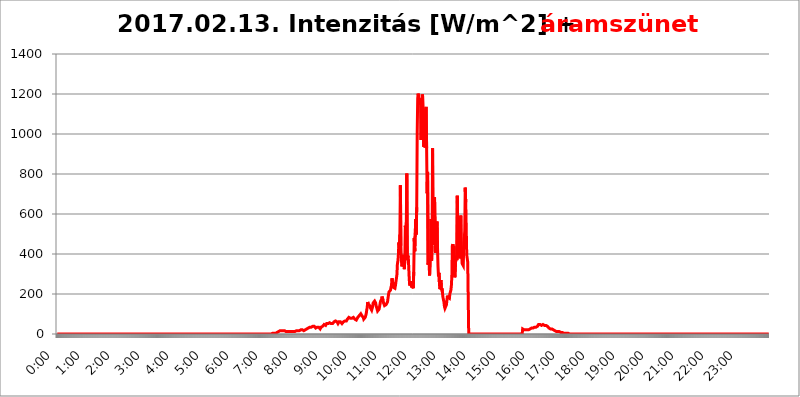
| Category | 2017.02.13. Intenzitás [W/m^2] + áramszünet |
|---|---|
| 0.0 | 0 |
| 0.0006944444444444445 | 0 |
| 0.001388888888888889 | 0 |
| 0.0020833333333333333 | 0 |
| 0.002777777777777778 | 0 |
| 0.003472222222222222 | 0 |
| 0.004166666666666667 | 0 |
| 0.004861111111111111 | 0 |
| 0.005555555555555556 | 0 |
| 0.0062499999999999995 | 0 |
| 0.006944444444444444 | 0 |
| 0.007638888888888889 | 0 |
| 0.008333333333333333 | 0 |
| 0.009027777777777779 | 0 |
| 0.009722222222222222 | 0 |
| 0.010416666666666666 | 0 |
| 0.011111111111111112 | 0 |
| 0.011805555555555555 | 0 |
| 0.012499999999999999 | 0 |
| 0.013194444444444444 | 0 |
| 0.013888888888888888 | 0 |
| 0.014583333333333332 | 0 |
| 0.015277777777777777 | 0 |
| 0.015972222222222224 | 0 |
| 0.016666666666666666 | 0 |
| 0.017361111111111112 | 0 |
| 0.018055555555555557 | 0 |
| 0.01875 | 0 |
| 0.019444444444444445 | 0 |
| 0.02013888888888889 | 0 |
| 0.020833333333333332 | 0 |
| 0.02152777777777778 | 0 |
| 0.022222222222222223 | 0 |
| 0.02291666666666667 | 0 |
| 0.02361111111111111 | 0 |
| 0.024305555555555556 | 0 |
| 0.024999999999999998 | 0 |
| 0.025694444444444447 | 0 |
| 0.02638888888888889 | 0 |
| 0.027083333333333334 | 0 |
| 0.027777777777777776 | 0 |
| 0.02847222222222222 | 0 |
| 0.029166666666666664 | 0 |
| 0.029861111111111113 | 0 |
| 0.030555555555555555 | 0 |
| 0.03125 | 0 |
| 0.03194444444444445 | 0 |
| 0.03263888888888889 | 0 |
| 0.03333333333333333 | 0 |
| 0.034027777777777775 | 0 |
| 0.034722222222222224 | 0 |
| 0.035416666666666666 | 0 |
| 0.036111111111111115 | 0 |
| 0.03680555555555556 | 0 |
| 0.0375 | 0 |
| 0.03819444444444444 | 0 |
| 0.03888888888888889 | 0 |
| 0.03958333333333333 | 0 |
| 0.04027777777777778 | 0 |
| 0.04097222222222222 | 0 |
| 0.041666666666666664 | 0 |
| 0.042361111111111106 | 0 |
| 0.04305555555555556 | 0 |
| 0.043750000000000004 | 0 |
| 0.044444444444444446 | 0 |
| 0.04513888888888889 | 0 |
| 0.04583333333333334 | 0 |
| 0.04652777777777778 | 0 |
| 0.04722222222222222 | 0 |
| 0.04791666666666666 | 0 |
| 0.04861111111111111 | 0 |
| 0.049305555555555554 | 0 |
| 0.049999999999999996 | 0 |
| 0.05069444444444445 | 0 |
| 0.051388888888888894 | 0 |
| 0.052083333333333336 | 0 |
| 0.05277777777777778 | 0 |
| 0.05347222222222222 | 0 |
| 0.05416666666666667 | 0 |
| 0.05486111111111111 | 0 |
| 0.05555555555555555 | 0 |
| 0.05625 | 0 |
| 0.05694444444444444 | 0 |
| 0.057638888888888885 | 0 |
| 0.05833333333333333 | 0 |
| 0.05902777777777778 | 0 |
| 0.059722222222222225 | 0 |
| 0.06041666666666667 | 0 |
| 0.061111111111111116 | 0 |
| 0.06180555555555556 | 0 |
| 0.0625 | 0 |
| 0.06319444444444444 | 0 |
| 0.06388888888888888 | 0 |
| 0.06458333333333334 | 0 |
| 0.06527777777777778 | 0 |
| 0.06597222222222222 | 0 |
| 0.06666666666666667 | 0 |
| 0.06736111111111111 | 0 |
| 0.06805555555555555 | 0 |
| 0.06874999999999999 | 0 |
| 0.06944444444444443 | 0 |
| 0.07013888888888889 | 0 |
| 0.07083333333333333 | 0 |
| 0.07152777777777779 | 0 |
| 0.07222222222222223 | 0 |
| 0.07291666666666667 | 0 |
| 0.07361111111111111 | 0 |
| 0.07430555555555556 | 0 |
| 0.075 | 0 |
| 0.07569444444444444 | 0 |
| 0.0763888888888889 | 0 |
| 0.07708333333333334 | 0 |
| 0.07777777777777778 | 0 |
| 0.07847222222222222 | 0 |
| 0.07916666666666666 | 0 |
| 0.0798611111111111 | 0 |
| 0.08055555555555556 | 0 |
| 0.08125 | 0 |
| 0.08194444444444444 | 0 |
| 0.08263888888888889 | 0 |
| 0.08333333333333333 | 0 |
| 0.08402777777777777 | 0 |
| 0.08472222222222221 | 0 |
| 0.08541666666666665 | 0 |
| 0.08611111111111112 | 0 |
| 0.08680555555555557 | 0 |
| 0.08750000000000001 | 0 |
| 0.08819444444444445 | 0 |
| 0.08888888888888889 | 0 |
| 0.08958333333333333 | 0 |
| 0.09027777777777778 | 0 |
| 0.09097222222222222 | 0 |
| 0.09166666666666667 | 0 |
| 0.09236111111111112 | 0 |
| 0.09305555555555556 | 0 |
| 0.09375 | 0 |
| 0.09444444444444444 | 0 |
| 0.09513888888888888 | 0 |
| 0.09583333333333333 | 0 |
| 0.09652777777777777 | 0 |
| 0.09722222222222222 | 0 |
| 0.09791666666666667 | 0 |
| 0.09861111111111111 | 0 |
| 0.09930555555555555 | 0 |
| 0.09999999999999999 | 0 |
| 0.10069444444444443 | 0 |
| 0.1013888888888889 | 0 |
| 0.10208333333333335 | 0 |
| 0.10277777777777779 | 0 |
| 0.10347222222222223 | 0 |
| 0.10416666666666667 | 0 |
| 0.10486111111111111 | 0 |
| 0.10555555555555556 | 0 |
| 0.10625 | 0 |
| 0.10694444444444444 | 0 |
| 0.1076388888888889 | 0 |
| 0.10833333333333334 | 0 |
| 0.10902777777777778 | 0 |
| 0.10972222222222222 | 0 |
| 0.1111111111111111 | 0 |
| 0.11180555555555556 | 0 |
| 0.11180555555555556 | 0 |
| 0.1125 | 0 |
| 0.11319444444444444 | 0 |
| 0.11388888888888889 | 0 |
| 0.11458333333333333 | 0 |
| 0.11527777777777777 | 0 |
| 0.11597222222222221 | 0 |
| 0.11666666666666665 | 0 |
| 0.1173611111111111 | 0 |
| 0.11805555555555557 | 0 |
| 0.11944444444444445 | 0 |
| 0.12013888888888889 | 0 |
| 0.12083333333333333 | 0 |
| 0.12152777777777778 | 0 |
| 0.12222222222222223 | 0 |
| 0.12291666666666667 | 0 |
| 0.12291666666666667 | 0 |
| 0.12361111111111112 | 0 |
| 0.12430555555555556 | 0 |
| 0.125 | 0 |
| 0.12569444444444444 | 0 |
| 0.12638888888888888 | 0 |
| 0.12708333333333333 | 0 |
| 0.16875 | 0 |
| 0.12847222222222224 | 0 |
| 0.12916666666666668 | 0 |
| 0.12986111111111112 | 0 |
| 0.13055555555555556 | 0 |
| 0.13125 | 0 |
| 0.13194444444444445 | 0 |
| 0.1326388888888889 | 0 |
| 0.13333333333333333 | 0 |
| 0.13402777777777777 | 0 |
| 0.13402777777777777 | 0 |
| 0.13472222222222222 | 0 |
| 0.13541666666666666 | 0 |
| 0.1361111111111111 | 0 |
| 0.13749999999999998 | 0 |
| 0.13819444444444443 | 0 |
| 0.1388888888888889 | 0 |
| 0.13958333333333334 | 0 |
| 0.14027777777777778 | 0 |
| 0.14097222222222222 | 0 |
| 0.14166666666666666 | 0 |
| 0.1423611111111111 | 0 |
| 0.14305555555555557 | 0 |
| 0.14375000000000002 | 0 |
| 0.14444444444444446 | 0 |
| 0.1451388888888889 | 0 |
| 0.1451388888888889 | 0 |
| 0.14652777777777778 | 0 |
| 0.14722222222222223 | 0 |
| 0.14791666666666667 | 0 |
| 0.1486111111111111 | 0 |
| 0.14930555555555555 | 0 |
| 0.15 | 0 |
| 0.15069444444444444 | 0 |
| 0.15138888888888888 | 0 |
| 0.15208333333333332 | 0 |
| 0.15277777777777776 | 0 |
| 0.15347222222222223 | 0 |
| 0.15416666666666667 | 0 |
| 0.15486111111111112 | 0 |
| 0.15555555555555556 | 0 |
| 0.15625 | 0 |
| 0.15694444444444444 | 0 |
| 0.15763888888888888 | 0 |
| 0.15833333333333333 | 0 |
| 0.15902777777777777 | 0 |
| 0.15972222222222224 | 0 |
| 0.16041666666666668 | 0 |
| 0.16111111111111112 | 0 |
| 0.16180555555555556 | 0 |
| 0.1625 | 0 |
| 0.16319444444444445 | 0 |
| 0.1638888888888889 | 0 |
| 0.16458333333333333 | 0 |
| 0.16527777777777777 | 0 |
| 0.16597222222222222 | 0 |
| 0.16666666666666666 | 0 |
| 0.1673611111111111 | 0 |
| 0.16805555555555554 | 0 |
| 0.16874999999999998 | 0 |
| 0.16944444444444443 | 0 |
| 0.17013888888888887 | 0 |
| 0.1708333333333333 | 0 |
| 0.17152777777777775 | 0 |
| 0.17222222222222225 | 0 |
| 0.1729166666666667 | 0 |
| 0.17361111111111113 | 0 |
| 0.17430555555555557 | 0 |
| 0.17500000000000002 | 0 |
| 0.17569444444444446 | 0 |
| 0.1763888888888889 | 0 |
| 0.17708333333333334 | 0 |
| 0.17777777777777778 | 0 |
| 0.17847222222222223 | 0 |
| 0.17916666666666667 | 0 |
| 0.1798611111111111 | 0 |
| 0.18055555555555555 | 0 |
| 0.18125 | 0 |
| 0.18194444444444444 | 0 |
| 0.1826388888888889 | 0 |
| 0.18333333333333335 | 0 |
| 0.1840277777777778 | 0 |
| 0.18472222222222223 | 0 |
| 0.18541666666666667 | 0 |
| 0.18611111111111112 | 0 |
| 0.18680555555555556 | 0 |
| 0.1875 | 0 |
| 0.18819444444444444 | 0 |
| 0.18888888888888888 | 0 |
| 0.18958333333333333 | 0 |
| 0.19027777777777777 | 0 |
| 0.1909722222222222 | 0 |
| 0.19166666666666665 | 0 |
| 0.19236111111111112 | 0 |
| 0.19305555555555554 | 0 |
| 0.19375 | 0 |
| 0.19444444444444445 | 0 |
| 0.1951388888888889 | 0 |
| 0.19583333333333333 | 0 |
| 0.19652777777777777 | 0 |
| 0.19722222222222222 | 0 |
| 0.19791666666666666 | 0 |
| 0.1986111111111111 | 0 |
| 0.19930555555555554 | 0 |
| 0.19999999999999998 | 0 |
| 0.20069444444444443 | 0 |
| 0.20138888888888887 | 0 |
| 0.2020833333333333 | 0 |
| 0.2027777777777778 | 0 |
| 0.2034722222222222 | 0 |
| 0.2041666666666667 | 0 |
| 0.20486111111111113 | 0 |
| 0.20555555555555557 | 0 |
| 0.20625000000000002 | 0 |
| 0.20694444444444446 | 0 |
| 0.2076388888888889 | 0 |
| 0.20833333333333334 | 0 |
| 0.20902777777777778 | 0 |
| 0.20972222222222223 | 0 |
| 0.21041666666666667 | 0 |
| 0.2111111111111111 | 0 |
| 0.21180555555555555 | 0 |
| 0.2125 | 0 |
| 0.21319444444444444 | 0 |
| 0.2138888888888889 | 0 |
| 0.21458333333333335 | 0 |
| 0.2152777777777778 | 0 |
| 0.21597222222222223 | 0 |
| 0.21666666666666667 | 0 |
| 0.21736111111111112 | 0 |
| 0.21805555555555556 | 0 |
| 0.21875 | 0 |
| 0.21944444444444444 | 0 |
| 0.22013888888888888 | 0 |
| 0.22083333333333333 | 0 |
| 0.22152777777777777 | 0 |
| 0.2222222222222222 | 0 |
| 0.22291666666666665 | 0 |
| 0.2236111111111111 | 0 |
| 0.22430555555555556 | 0 |
| 0.225 | 0 |
| 0.22569444444444445 | 0 |
| 0.2263888888888889 | 0 |
| 0.22708333333333333 | 0 |
| 0.22777777777777777 | 0 |
| 0.22847222222222222 | 0 |
| 0.22916666666666666 | 0 |
| 0.2298611111111111 | 0 |
| 0.23055555555555554 | 0 |
| 0.23124999999999998 | 0 |
| 0.23194444444444443 | 0 |
| 0.23263888888888887 | 0 |
| 0.2333333333333333 | 0 |
| 0.2340277777777778 | 0 |
| 0.2347222222222222 | 0 |
| 0.2354166666666667 | 0 |
| 0.23611111111111113 | 0 |
| 0.23680555555555557 | 0 |
| 0.23750000000000002 | 0 |
| 0.23819444444444446 | 0 |
| 0.2388888888888889 | 0 |
| 0.23958333333333334 | 0 |
| 0.24027777777777778 | 0 |
| 0.24097222222222223 | 0 |
| 0.24166666666666667 | 0 |
| 0.2423611111111111 | 0 |
| 0.24305555555555555 | 0 |
| 0.24375 | 0 |
| 0.24444444444444446 | 0 |
| 0.24513888888888888 | 0 |
| 0.24583333333333335 | 0 |
| 0.2465277777777778 | 0 |
| 0.24722222222222223 | 0 |
| 0.24791666666666667 | 0 |
| 0.24861111111111112 | 0 |
| 0.24930555555555556 | 0 |
| 0.25 | 0 |
| 0.25069444444444444 | 0 |
| 0.2513888888888889 | 0 |
| 0.2520833333333333 | 0 |
| 0.25277777777777777 | 0 |
| 0.2534722222222222 | 0 |
| 0.25416666666666665 | 0 |
| 0.2548611111111111 | 0 |
| 0.2555555555555556 | 0 |
| 0.25625000000000003 | 0 |
| 0.2569444444444445 | 0 |
| 0.2576388888888889 | 0 |
| 0.25833333333333336 | 0 |
| 0.2590277777777778 | 0 |
| 0.25972222222222224 | 0 |
| 0.2604166666666667 | 0 |
| 0.2611111111111111 | 0 |
| 0.26180555555555557 | 0 |
| 0.2625 | 0 |
| 0.26319444444444445 | 0 |
| 0.2638888888888889 | 0 |
| 0.26458333333333334 | 0 |
| 0.2652777777777778 | 0 |
| 0.2659722222222222 | 0 |
| 0.26666666666666666 | 0 |
| 0.2673611111111111 | 0 |
| 0.26805555555555555 | 0 |
| 0.26875 | 0 |
| 0.26944444444444443 | 0 |
| 0.2701388888888889 | 0 |
| 0.2708333333333333 | 0 |
| 0.27152777777777776 | 0 |
| 0.2722222222222222 | 0 |
| 0.27291666666666664 | 0 |
| 0.2736111111111111 | 0 |
| 0.2743055555555555 | 0 |
| 0.27499999999999997 | 0 |
| 0.27569444444444446 | 0 |
| 0.27638888888888885 | 0 |
| 0.27708333333333335 | 0 |
| 0.2777777777777778 | 0 |
| 0.27847222222222223 | 0 |
| 0.2791666666666667 | 0 |
| 0.2798611111111111 | 0 |
| 0.28055555555555556 | 0 |
| 0.28125 | 0 |
| 0.28194444444444444 | 0 |
| 0.2826388888888889 | 0 |
| 0.2833333333333333 | 0 |
| 0.28402777777777777 | 0 |
| 0.2847222222222222 | 0 |
| 0.28541666666666665 | 0 |
| 0.28611111111111115 | 0 |
| 0.28680555555555554 | 0 |
| 0.28750000000000003 | 0 |
| 0.2881944444444445 | 0 |
| 0.2888888888888889 | 0 |
| 0.28958333333333336 | 0 |
| 0.2902777777777778 | 0 |
| 0.29097222222222224 | 0 |
| 0.2916666666666667 | 0 |
| 0.2923611111111111 | 0 |
| 0.29305555555555557 | 0 |
| 0.29375 | 0 |
| 0.29444444444444445 | 0 |
| 0.2951388888888889 | 0 |
| 0.29583333333333334 | 0 |
| 0.2965277777777778 | 0 |
| 0.2972222222222222 | 0 |
| 0.29791666666666666 | 0 |
| 0.2986111111111111 | 0 |
| 0.29930555555555555 | 0 |
| 0.3 | 0 |
| 0.30069444444444443 | 3.525 |
| 0.3013888888888889 | 3.525 |
| 0.3020833333333333 | 3.525 |
| 0.30277777777777776 | 3.525 |
| 0.3034722222222222 | 3.525 |
| 0.30416666666666664 | 3.525 |
| 0.3048611111111111 | 3.525 |
| 0.3055555555555555 | 3.525 |
| 0.30624999999999997 | 3.525 |
| 0.3069444444444444 | 7.887 |
| 0.3076388888888889 | 7.887 |
| 0.30833333333333335 | 7.887 |
| 0.3090277777777778 | 12.257 |
| 0.30972222222222223 | 12.257 |
| 0.3104166666666667 | 12.257 |
| 0.3111111111111111 | 12.257 |
| 0.31180555555555556 | 12.257 |
| 0.3125 | 16.636 |
| 0.31319444444444444 | 16.636 |
| 0.3138888888888889 | 16.636 |
| 0.3145833333333333 | 16.636 |
| 0.31527777777777777 | 21.024 |
| 0.3159722222222222 | 21.024 |
| 0.31666666666666665 | 16.636 |
| 0.31736111111111115 | 16.636 |
| 0.31805555555555554 | 16.636 |
| 0.31875000000000003 | 16.636 |
| 0.3194444444444445 | 12.257 |
| 0.3201388888888889 | 12.257 |
| 0.32083333333333336 | 12.257 |
| 0.3215277777777778 | 12.257 |
| 0.32222222222222224 | 12.257 |
| 0.3229166666666667 | 12.257 |
| 0.3236111111111111 | 12.257 |
| 0.32430555555555557 | 12.257 |
| 0.325 | 12.257 |
| 0.32569444444444445 | 12.257 |
| 0.3263888888888889 | 16.636 |
| 0.32708333333333334 | 12.257 |
| 0.3277777777777778 | 12.257 |
| 0.3284722222222222 | 12.257 |
| 0.32916666666666666 | 12.257 |
| 0.3298611111111111 | 16.636 |
| 0.33055555555555555 | 16.636 |
| 0.33125 | 12.257 |
| 0.33194444444444443 | 12.257 |
| 0.3326388888888889 | 12.257 |
| 0.3333333333333333 | 12.257 |
| 0.3340277777777778 | 16.636 |
| 0.3347222222222222 | 16.636 |
| 0.3354166666666667 | 16.636 |
| 0.3361111111111111 | 16.636 |
| 0.3368055555555556 | 12.257 |
| 0.33749999999999997 | 16.636 |
| 0.33819444444444446 | 16.636 |
| 0.33888888888888885 | 16.636 |
| 0.33958333333333335 | 16.636 |
| 0.34027777777777773 | 21.024 |
| 0.34097222222222223 | 21.024 |
| 0.3416666666666666 | 21.024 |
| 0.3423611111111111 | 21.024 |
| 0.3430555555555555 | 21.024 |
| 0.34375 | 21.024 |
| 0.3444444444444445 | 16.636 |
| 0.3451388888888889 | 16.636 |
| 0.3458333333333334 | 16.636 |
| 0.34652777777777777 | 21.024 |
| 0.34722222222222227 | 21.024 |
| 0.34791666666666665 | 21.024 |
| 0.34861111111111115 | 21.024 |
| 0.34930555555555554 | 25.419 |
| 0.35000000000000003 | 25.419 |
| 0.3506944444444444 | 25.419 |
| 0.3513888888888889 | 25.419 |
| 0.3520833333333333 | 29.823 |
| 0.3527777777777778 | 29.823 |
| 0.3534722222222222 | 34.234 |
| 0.3541666666666667 | 34.234 |
| 0.3548611111111111 | 29.823 |
| 0.35555555555555557 | 29.823 |
| 0.35625 | 34.234 |
| 0.35694444444444445 | 38.653 |
| 0.3576388888888889 | 38.653 |
| 0.35833333333333334 | 38.653 |
| 0.3590277777777778 | 38.653 |
| 0.3597222222222222 | 38.653 |
| 0.36041666666666666 | 38.653 |
| 0.3611111111111111 | 34.234 |
| 0.36180555555555555 | 34.234 |
| 0.3625 | 29.823 |
| 0.36319444444444443 | 29.823 |
| 0.3638888888888889 | 34.234 |
| 0.3645833333333333 | 34.234 |
| 0.3652777777777778 | 34.234 |
| 0.3659722222222222 | 34.234 |
| 0.3666666666666667 | 34.234 |
| 0.3673611111111111 | 29.823 |
| 0.3680555555555556 | 29.823 |
| 0.36874999999999997 | 25.419 |
| 0.36944444444444446 | 25.419 |
| 0.37013888888888885 | 34.234 |
| 0.37083333333333335 | 38.653 |
| 0.37152777777777773 | 38.653 |
| 0.37222222222222223 | 38.653 |
| 0.3729166666666666 | 38.653 |
| 0.3736111111111111 | 43.079 |
| 0.3743055555555555 | 47.511 |
| 0.375 | 47.511 |
| 0.3756944444444445 | 43.079 |
| 0.3763888888888889 | 43.079 |
| 0.3770833333333334 | 47.511 |
| 0.37777777777777777 | 51.951 |
| 0.37847222222222227 | 56.398 |
| 0.37916666666666665 | 56.398 |
| 0.37986111111111115 | 51.951 |
| 0.38055555555555554 | 56.398 |
| 0.38125000000000003 | 56.398 |
| 0.3819444444444444 | 56.398 |
| 0.3826388888888889 | 51.951 |
| 0.3833333333333333 | 56.398 |
| 0.3840277777777778 | 51.951 |
| 0.3847222222222222 | 51.951 |
| 0.3854166666666667 | 51.951 |
| 0.3861111111111111 | 51.951 |
| 0.38680555555555557 | 47.511 |
| 0.3875 | 56.398 |
| 0.38819444444444445 | 60.85 |
| 0.3888888888888889 | 60.85 |
| 0.38958333333333334 | 60.85 |
| 0.3902777777777778 | 65.31 |
| 0.3909722222222222 | 65.31 |
| 0.39166666666666666 | 60.85 |
| 0.3923611111111111 | 60.85 |
| 0.39305555555555555 | 56.398 |
| 0.39375 | 51.951 |
| 0.39444444444444443 | 56.398 |
| 0.3951388888888889 | 60.85 |
| 0.3958333333333333 | 60.85 |
| 0.3965277777777778 | 60.85 |
| 0.3972222222222222 | 60.85 |
| 0.3979166666666667 | 56.398 |
| 0.3986111111111111 | 56.398 |
| 0.3993055555555556 | 51.951 |
| 0.39999999999999997 | 56.398 |
| 0.40069444444444446 | 56.398 |
| 0.40138888888888885 | 60.85 |
| 0.40208333333333335 | 60.85 |
| 0.40277777777777773 | 60.85 |
| 0.40347222222222223 | 65.31 |
| 0.4041666666666666 | 65.31 |
| 0.4048611111111111 | 65.31 |
| 0.4055555555555555 | 65.31 |
| 0.40625 | 69.775 |
| 0.4069444444444445 | 74.246 |
| 0.4076388888888889 | 78.722 |
| 0.4083333333333334 | 78.722 |
| 0.40902777777777777 | 83.205 |
| 0.40972222222222227 | 83.205 |
| 0.41041666666666665 | 83.205 |
| 0.41111111111111115 | 78.722 |
| 0.41180555555555554 | 78.722 |
| 0.41250000000000003 | 83.205 |
| 0.4131944444444444 | 78.722 |
| 0.4138888888888889 | 83.205 |
| 0.4145833333333333 | 83.205 |
| 0.4152777777777778 | 83.205 |
| 0.4159722222222222 | 78.722 |
| 0.4166666666666667 | 78.722 |
| 0.4173611111111111 | 74.246 |
| 0.41805555555555557 | 74.246 |
| 0.41875 | 69.775 |
| 0.41944444444444445 | 69.775 |
| 0.4201388888888889 | 74.246 |
| 0.42083333333333334 | 74.246 |
| 0.4215277777777778 | 83.205 |
| 0.4222222222222222 | 83.205 |
| 0.42291666666666666 | 87.692 |
| 0.4236111111111111 | 92.184 |
| 0.42430555555555555 | 92.184 |
| 0.425 | 96.682 |
| 0.42569444444444443 | 101.184 |
| 0.4263888888888889 | 101.184 |
| 0.4270833333333333 | 92.184 |
| 0.4277777777777778 | 96.682 |
| 0.4284722222222222 | 96.682 |
| 0.4291666666666667 | 83.205 |
| 0.4298611111111111 | 74.246 |
| 0.4305555555555556 | 74.246 |
| 0.43124999999999997 | 74.246 |
| 0.43194444444444446 | 83.205 |
| 0.43263888888888885 | 87.692 |
| 0.43333333333333335 | 101.184 |
| 0.43402777777777773 | 119.235 |
| 0.43472222222222223 | 132.814 |
| 0.4354166666666666 | 160.056 |
| 0.4361111111111111 | 150.964 |
| 0.4368055555555555 | 150.964 |
| 0.4375 | 150.964 |
| 0.4381944444444445 | 141.884 |
| 0.4388888888888889 | 132.814 |
| 0.4395833333333334 | 132.814 |
| 0.44027777777777777 | 137.347 |
| 0.44097222222222227 | 119.235 |
| 0.44166666666666665 | 114.716 |
| 0.44236111111111115 | 137.347 |
| 0.44305555555555554 | 155.509 |
| 0.44375000000000003 | 150.964 |
| 0.4444444444444444 | 150.964 |
| 0.4451388888888889 | 164.605 |
| 0.4458333333333333 | 169.156 |
| 0.4465277777777778 | 155.509 |
| 0.4472222222222222 | 141.884 |
| 0.4479166666666667 | 132.814 |
| 0.4486111111111111 | 128.284 |
| 0.44930555555555557 | 114.716 |
| 0.45 | 114.716 |
| 0.45069444444444445 | 114.716 |
| 0.4513888888888889 | 123.758 |
| 0.45208333333333334 | 137.347 |
| 0.4527777777777778 | 150.964 |
| 0.4534722222222222 | 164.605 |
| 0.45416666666666666 | 164.605 |
| 0.4548611111111111 | 173.709 |
| 0.45555555555555555 | 187.378 |
| 0.45625 | 187.378 |
| 0.45694444444444443 | 169.156 |
| 0.4576388888888889 | 155.509 |
| 0.4583333333333333 | 150.964 |
| 0.4590277777777778 | 141.884 |
| 0.4597222222222222 | 137.347 |
| 0.4604166666666667 | 137.347 |
| 0.4611111111111111 | 146.423 |
| 0.4618055555555556 | 146.423 |
| 0.46249999999999997 | 146.423 |
| 0.46319444444444446 | 160.056 |
| 0.46388888888888885 | 178.264 |
| 0.46458333333333335 | 196.497 |
| 0.46527777777777773 | 210.182 |
| 0.46597222222222223 | 205.62 |
| 0.4666666666666666 | 210.182 |
| 0.4673611111111111 | 219.309 |
| 0.4680555555555555 | 233 |
| 0.46875 | 242.127 |
| 0.4694444444444445 | 278.603 |
| 0.4701388888888889 | 278.603 |
| 0.4708333333333334 | 251.251 |
| 0.47152777777777777 | 233 |
| 0.47222222222222227 | 237.564 |
| 0.47291666666666665 | 228.436 |
| 0.47361111111111115 | 228.436 |
| 0.47430555555555554 | 242.127 |
| 0.47500000000000003 | 260.373 |
| 0.4756944444444444 | 264.932 |
| 0.4763888888888889 | 296.808 |
| 0.4770833333333333 | 351.198 |
| 0.4777777777777778 | 364.728 |
| 0.4784722222222222 | 396.164 |
| 0.4791666666666667 | 458.38 |
| 0.4798611111111111 | 427.39 |
| 0.48055555555555557 | 497.836 |
| 0.48125 | 743.859 |
| 0.48194444444444445 | 440.702 |
| 0.4826388888888889 | 369.23 |
| 0.48333333333333334 | 337.639 |
| 0.4840277777777778 | 333.113 |
| 0.4847222222222222 | 355.712 |
| 0.48541666666666666 | 396.164 |
| 0.4861111111111111 | 360.221 |
| 0.48680555555555555 | 324.052 |
| 0.4875 | 373.729 |
| 0.48819444444444443 | 541.121 |
| 0.4888888888888889 | 489.108 |
| 0.4895833333333333 | 558.261 |
| 0.4902777777777778 | 802.868 |
| 0.4909722222222222 | 369.23 |
| 0.4916666666666667 | 391.685 |
| 0.4923611111111111 | 382.715 |
| 0.4930555555555556 | 378.224 |
| 0.49374999999999997 | 269.49 |
| 0.49444444444444446 | 242.127 |
| 0.49513888888888885 | 246.689 |
| 0.49583333333333335 | 264.932 |
| 0.49652777777777773 | 242.127 |
| 0.49722222222222223 | 233 |
| 0.4979166666666666 | 251.251 |
| 0.4986111111111111 | 251.251 |
| 0.4993055555555555 | 228.436 |
| 0.5 | 310.44 |
| 0.5006944444444444 | 480.356 |
| 0.5013888888888889 | 414.035 |
| 0.5020833333333333 | 506.542 |
| 0.5027777777777778 | 575.299 |
| 0.5034722222222222 | 497.836 |
| 0.5041666666666667 | 634.105 |
| 0.5048611111111111 | 1007.383 |
| 0.5055555555555555 | 1178.177 |
| 0.50625 | 1201.843 |
| 0.5069444444444444 | 1178.177 |
| 0.5076388888888889 | 1178.177 |
| 0.5083333333333333 | 1147.086 |
| 0.5090277777777777 | 1166.46 |
| 0.5097222222222222 | 1178.177 |
| 0.5104166666666666 | 970.034 |
| 0.5111111111111112 | 1139.384 |
| 0.5118055555555555 | 1197.876 |
| 0.5125000000000001 | 1189.969 |
| 0.5131944444444444 | 1127.879 |
| 0.513888888888889 | 936.33 |
| 0.5145833333333333 | 1044.762 |
| 0.5152777777777778 | 1056.004 |
| 0.5159722222222222 | 932.576 |
| 0.5166666666666667 | 1124.056 |
| 0.517361111111111 | 1135.543 |
| 0.5180555555555556 | 928.819 |
| 0.5187499999999999 | 703.762 |
| 0.5194444444444445 | 810.641 |
| 0.5201388888888888 | 346.682 |
| 0.5208333333333334 | 360.221 |
| 0.5215277777777778 | 351.198 |
| 0.5222222222222223 | 292.259 |
| 0.5229166666666667 | 364.728 |
| 0.5236111111111111 | 378.224 |
| 0.5243055555555556 | 575.299 |
| 0.525 | 364.728 |
| 0.5256944444444445 | 440.702 |
| 0.5263888888888889 | 928.819 |
| 0.5270833333333333 | 493.475 |
| 0.5277777777777778 | 445.129 |
| 0.5284722222222222 | 458.38 |
| 0.5291666666666667 | 683.473 |
| 0.5298611111111111 | 541.121 |
| 0.5305555555555556 | 405.108 |
| 0.53125 | 405.108 |
| 0.5319444444444444 | 489.108 |
| 0.5326388888888889 | 562.53 |
| 0.5333333333333333 | 431.833 |
| 0.5340277777777778 | 337.639 |
| 0.5347222222222222 | 287.709 |
| 0.5354166666666667 | 305.898 |
| 0.5361111111111111 | 246.689 |
| 0.5368055555555555 | 223.873 |
| 0.5375 | 246.689 |
| 0.5381944444444444 | 269.49 |
| 0.5388888888888889 | 219.309 |
| 0.5395833333333333 | 228.436 |
| 0.5402777777777777 | 205.62 |
| 0.5409722222222222 | 182.82 |
| 0.5416666666666666 | 182.82 |
| 0.5423611111111112 | 160.056 |
| 0.5430555555555555 | 137.347 |
| 0.5437500000000001 | 128.284 |
| 0.5444444444444444 | 128.284 |
| 0.545138888888889 | 132.814 |
| 0.5458333333333333 | 146.423 |
| 0.5465277777777778 | 169.156 |
| 0.5472222222222222 | 191.937 |
| 0.5479166666666667 | 182.82 |
| 0.548611111111111 | 187.378 |
| 0.5493055555555556 | 187.378 |
| 0.5499999999999999 | 178.264 |
| 0.5506944444444445 | 201.058 |
| 0.5513888888888888 | 210.182 |
| 0.5520833333333334 | 219.309 |
| 0.5527777777777778 | 242.127 |
| 0.5534722222222223 | 292.259 |
| 0.5541666666666667 | 440.702 |
| 0.5548611111111111 | 449.551 |
| 0.5555555555555556 | 409.574 |
| 0.55625 | 440.702 |
| 0.5569444444444445 | 305.898 |
| 0.5576388888888889 | 283.156 |
| 0.5583333333333333 | 278.603 |
| 0.5590277777777778 | 382.715 |
| 0.5597222222222222 | 391.685 |
| 0.5604166666666667 | 369.23 |
| 0.5611111111111111 | 691.608 |
| 0.5618055555555556 | 471.582 |
| 0.5625 | 579.542 |
| 0.5631944444444444 | 405.108 |
| 0.5638888888888889 | 405.108 |
| 0.5645833333333333 | 378.224 |
| 0.5652777777777778 | 409.574 |
| 0.5659722222222222 | 592.233 |
| 0.5666666666666667 | 422.943 |
| 0.5673611111111111 | 431.833 |
| 0.5680555555555555 | 351.198 |
| 0.56875 | 351.198 |
| 0.5694444444444444 | 342.162 |
| 0.5701388888888889 | 440.702 |
| 0.5708333333333333 | 436.27 |
| 0.5715277777777777 | 515.223 |
| 0.5722222222222222 | 731.896 |
| 0.5729166666666666 | 658.909 |
| 0.5736111111111112 | 528.2 |
| 0.5743055555555555 | 396.164 |
| 0.5750000000000001 | 400.638 |
| 0.5756944444444444 | 360.221 |
| 0.576388888888889 | 360.221 |
| 0.5770833333333333 | 0 |
| 0.5777777777777778 | 0 |
| 0.5784722222222222 | 0 |
| 0.5791666666666667 | 0 |
| 0.579861111111111 | 0 |
| 0.5805555555555556 | 0 |
| 0.5812499999999999 | 0 |
| 0.5819444444444445 | 0 |
| 0.5826388888888888 | 0 |
| 0.5833333333333334 | 0 |
| 0.5840277777777778 | 0 |
| 0.5847222222222223 | 0 |
| 0.5854166666666667 | 0 |
| 0.5861111111111111 | 0 |
| 0.5868055555555556 | 0 |
| 0.5875 | 0 |
| 0.5881944444444445 | 0 |
| 0.5888888888888889 | 0 |
| 0.5895833333333333 | 0 |
| 0.5902777777777778 | 0 |
| 0.5909722222222222 | 0 |
| 0.5916666666666667 | 0 |
| 0.5923611111111111 | 0 |
| 0.5930555555555556 | 0 |
| 0.59375 | 0 |
| 0.5944444444444444 | 0 |
| 0.5951388888888889 | 0 |
| 0.5958333333333333 | 0 |
| 0.5965277777777778 | 0 |
| 0.5972222222222222 | 0 |
| 0.5979166666666667 | 0 |
| 0.5986111111111111 | 0 |
| 0.5993055555555555 | 0 |
| 0.6 | 0 |
| 0.6006944444444444 | 0 |
| 0.6013888888888889 | 0 |
| 0.6020833333333333 | 0 |
| 0.6027777777777777 | 0 |
| 0.6034722222222222 | 0 |
| 0.6041666666666666 | 0 |
| 0.6048611111111112 | 0 |
| 0.6055555555555555 | 0 |
| 0.6062500000000001 | 0 |
| 0.6069444444444444 | 0 |
| 0.607638888888889 | 0 |
| 0.6083333333333333 | 0 |
| 0.6090277777777778 | 0 |
| 0.6097222222222222 | 0 |
| 0.6104166666666667 | 0 |
| 0.611111111111111 | 0 |
| 0.6118055555555556 | 0 |
| 0.6124999999999999 | 0 |
| 0.6131944444444445 | 0 |
| 0.6138888888888888 | 0 |
| 0.6145833333333334 | 0 |
| 0.6152777777777778 | 0 |
| 0.6159722222222223 | 0 |
| 0.6166666666666667 | 0 |
| 0.6173611111111111 | 0 |
| 0.6180555555555556 | 0 |
| 0.61875 | 0 |
| 0.6194444444444445 | 0 |
| 0.6201388888888889 | 0 |
| 0.6208333333333333 | 0 |
| 0.6215277777777778 | 0 |
| 0.6222222222222222 | 0 |
| 0.6229166666666667 | 0 |
| 0.6236111111111111 | 0 |
| 0.6243055555555556 | 0 |
| 0.625 | 0 |
| 0.6256944444444444 | 0 |
| 0.6263888888888889 | 0 |
| 0.6270833333333333 | 0 |
| 0.6277777777777778 | 0 |
| 0.6284722222222222 | 0 |
| 0.6291666666666667 | 0 |
| 0.6298611111111111 | 0 |
| 0.6305555555555555 | 0 |
| 0.63125 | 0 |
| 0.6319444444444444 | 0 |
| 0.6326388888888889 | 0 |
| 0.6333333333333333 | 0 |
| 0.6340277777777777 | 0 |
| 0.6347222222222222 | 0 |
| 0.6354166666666666 | 0 |
| 0.6361111111111112 | 0 |
| 0.6368055555555555 | 0 |
| 0.6375000000000001 | 0 |
| 0.6381944444444444 | 0 |
| 0.638888888888889 | 0 |
| 0.6395833333333333 | 0 |
| 0.6402777777777778 | 0 |
| 0.6409722222222222 | 0 |
| 0.6416666666666667 | 0 |
| 0.642361111111111 | 0 |
| 0.6430555555555556 | 0 |
| 0.6437499999999999 | 0 |
| 0.6444444444444445 | 0 |
| 0.6451388888888888 | 0 |
| 0.6458333333333334 | 0 |
| 0.6465277777777778 | 0 |
| 0.6472222222222223 | 0 |
| 0.6479166666666667 | 0 |
| 0.6486111111111111 | 0 |
| 0.6493055555555556 | 0 |
| 0.65 | 0 |
| 0.6506944444444445 | 0 |
| 0.6513888888888889 | 0 |
| 0.6520833333333333 | 0 |
| 0.6527777777777778 | 25.419 |
| 0.6534722222222222 | 25.419 |
| 0.6541666666666667 | 21.024 |
| 0.6548611111111111 | 21.024 |
| 0.6555555555555556 | 21.024 |
| 0.65625 | 21.024 |
| 0.6569444444444444 | 21.024 |
| 0.6576388888888889 | 21.024 |
| 0.6583333333333333 | 21.024 |
| 0.6590277777777778 | 21.024 |
| 0.6597222222222222 | 21.024 |
| 0.6604166666666667 | 21.024 |
| 0.6611111111111111 | 21.024 |
| 0.6618055555555555 | 25.419 |
| 0.6625 | 25.419 |
| 0.6631944444444444 | 25.419 |
| 0.6638888888888889 | 25.419 |
| 0.6645833333333333 | 29.823 |
| 0.6652777777777777 | 29.823 |
| 0.6659722222222222 | 29.823 |
| 0.6666666666666666 | 29.823 |
| 0.6673611111111111 | 29.823 |
| 0.6680555555555556 | 29.823 |
| 0.6687500000000001 | 34.234 |
| 0.6694444444444444 | 34.234 |
| 0.6701388888888888 | 34.234 |
| 0.6708333333333334 | 34.234 |
| 0.6715277777777778 | 34.234 |
| 0.6722222222222222 | 38.653 |
| 0.6729166666666666 | 38.653 |
| 0.6736111111111112 | 38.653 |
| 0.6743055555555556 | 43.079 |
| 0.6749999999999999 | 47.511 |
| 0.6756944444444444 | 47.511 |
| 0.6763888888888889 | 47.511 |
| 0.6770833333333334 | 47.511 |
| 0.6777777777777777 | 47.511 |
| 0.6784722222222223 | 47.511 |
| 0.6791666666666667 | 43.079 |
| 0.6798611111111111 | 43.079 |
| 0.6805555555555555 | 43.079 |
| 0.68125 | 47.511 |
| 0.6819444444444445 | 47.511 |
| 0.6826388888888889 | 43.079 |
| 0.6833333333333332 | 43.079 |
| 0.6840277777777778 | 43.079 |
| 0.6847222222222222 | 43.079 |
| 0.6854166666666667 | 43.079 |
| 0.686111111111111 | 43.079 |
| 0.6868055555555556 | 38.653 |
| 0.6875 | 38.653 |
| 0.6881944444444444 | 34.234 |
| 0.688888888888889 | 34.234 |
| 0.6895833333333333 | 29.823 |
| 0.6902777777777778 | 29.823 |
| 0.6909722222222222 | 25.419 |
| 0.6916666666666668 | 25.419 |
| 0.6923611111111111 | 25.419 |
| 0.6930555555555555 | 25.419 |
| 0.69375 | 25.419 |
| 0.6944444444444445 | 21.024 |
| 0.6951388888888889 | 21.024 |
| 0.6958333333333333 | 21.024 |
| 0.6965277777777777 | 16.636 |
| 0.6972222222222223 | 16.636 |
| 0.6979166666666666 | 16.636 |
| 0.6986111111111111 | 12.257 |
| 0.6993055555555556 | 12.257 |
| 0.7000000000000001 | 12.257 |
| 0.7006944444444444 | 12.257 |
| 0.7013888888888888 | 12.257 |
| 0.7020833333333334 | 12.257 |
| 0.7027777777777778 | 12.257 |
| 0.7034722222222222 | 12.257 |
| 0.7041666666666666 | 12.257 |
| 0.7048611111111112 | 12.257 |
| 0.7055555555555556 | 12.257 |
| 0.7062499999999999 | 7.887 |
| 0.7069444444444444 | 7.887 |
| 0.7076388888888889 | 7.887 |
| 0.7083333333333334 | 7.887 |
| 0.7090277777777777 | 3.525 |
| 0.7097222222222223 | 3.525 |
| 0.7104166666666667 | 3.525 |
| 0.7111111111111111 | 3.525 |
| 0.7118055555555555 | 3.525 |
| 0.7125 | 3.525 |
| 0.7131944444444445 | 3.525 |
| 0.7138888888888889 | 3.525 |
| 0.7145833333333332 | 3.525 |
| 0.7152777777777778 | 3.525 |
| 0.7159722222222222 | 3.525 |
| 0.7166666666666667 | 3.525 |
| 0.717361111111111 | 3.525 |
| 0.7180555555555556 | 0 |
| 0.71875 | 0 |
| 0.7194444444444444 | 0 |
| 0.720138888888889 | 0 |
| 0.7208333333333333 | 0 |
| 0.7215277777777778 | 0 |
| 0.7222222222222222 | 0 |
| 0.7229166666666668 | 0 |
| 0.7236111111111111 | 0 |
| 0.7243055555555555 | 0 |
| 0.725 | 0 |
| 0.7256944444444445 | 0 |
| 0.7263888888888889 | 0 |
| 0.7270833333333333 | 0 |
| 0.7277777777777777 | 0 |
| 0.7284722222222223 | 0 |
| 0.7291666666666666 | 0 |
| 0.7298611111111111 | 0 |
| 0.7305555555555556 | 0 |
| 0.7312500000000001 | 0 |
| 0.7319444444444444 | 0 |
| 0.7326388888888888 | 0 |
| 0.7333333333333334 | 0 |
| 0.7340277777777778 | 0 |
| 0.7347222222222222 | 0 |
| 0.7354166666666666 | 0 |
| 0.7361111111111112 | 0 |
| 0.7368055555555556 | 0 |
| 0.7374999999999999 | 0 |
| 0.7381944444444444 | 0 |
| 0.7388888888888889 | 0 |
| 0.7395833333333334 | 0 |
| 0.7402777777777777 | 0 |
| 0.7409722222222223 | 0 |
| 0.7416666666666667 | 0 |
| 0.7423611111111111 | 0 |
| 0.7430555555555555 | 0 |
| 0.74375 | 0 |
| 0.7444444444444445 | 0 |
| 0.7451388888888889 | 0 |
| 0.7458333333333332 | 0 |
| 0.7465277777777778 | 0 |
| 0.7472222222222222 | 0 |
| 0.7479166666666667 | 0 |
| 0.748611111111111 | 0 |
| 0.7493055555555556 | 0 |
| 0.75 | 0 |
| 0.7506944444444444 | 0 |
| 0.751388888888889 | 0 |
| 0.7520833333333333 | 0 |
| 0.7527777777777778 | 0 |
| 0.7534722222222222 | 0 |
| 0.7541666666666668 | 0 |
| 0.7548611111111111 | 0 |
| 0.7555555555555555 | 0 |
| 0.75625 | 0 |
| 0.7569444444444445 | 0 |
| 0.7576388888888889 | 0 |
| 0.7583333333333333 | 0 |
| 0.7590277777777777 | 0 |
| 0.7597222222222223 | 0 |
| 0.7604166666666666 | 0 |
| 0.7611111111111111 | 0 |
| 0.7618055555555556 | 0 |
| 0.7625000000000001 | 0 |
| 0.7631944444444444 | 0 |
| 0.7638888888888888 | 0 |
| 0.7645833333333334 | 0 |
| 0.7652777777777778 | 0 |
| 0.7659722222222222 | 0 |
| 0.7666666666666666 | 0 |
| 0.7673611111111112 | 0 |
| 0.7680555555555556 | 0 |
| 0.7687499999999999 | 0 |
| 0.7694444444444444 | 0 |
| 0.7701388888888889 | 0 |
| 0.7708333333333334 | 0 |
| 0.7715277777777777 | 0 |
| 0.7722222222222223 | 0 |
| 0.7729166666666667 | 0 |
| 0.7736111111111111 | 0 |
| 0.7743055555555555 | 0 |
| 0.775 | 0 |
| 0.7756944444444445 | 0 |
| 0.7763888888888889 | 0 |
| 0.7770833333333332 | 0 |
| 0.7777777777777778 | 0 |
| 0.7784722222222222 | 0 |
| 0.7791666666666667 | 0 |
| 0.779861111111111 | 0 |
| 0.7805555555555556 | 0 |
| 0.78125 | 0 |
| 0.7819444444444444 | 0 |
| 0.782638888888889 | 0 |
| 0.7833333333333333 | 0 |
| 0.7840277777777778 | 0 |
| 0.7847222222222222 | 0 |
| 0.7854166666666668 | 0 |
| 0.7861111111111111 | 0 |
| 0.7868055555555555 | 0 |
| 0.7875 | 0 |
| 0.7881944444444445 | 0 |
| 0.7888888888888889 | 0 |
| 0.7895833333333333 | 0 |
| 0.7902777777777777 | 0 |
| 0.7909722222222223 | 0 |
| 0.7916666666666666 | 0 |
| 0.7923611111111111 | 0 |
| 0.7930555555555556 | 0 |
| 0.7937500000000001 | 0 |
| 0.7944444444444444 | 0 |
| 0.7951388888888888 | 0 |
| 0.7958333333333334 | 0 |
| 0.7965277777777778 | 0 |
| 0.7972222222222222 | 0 |
| 0.7979166666666666 | 0 |
| 0.7986111111111112 | 0 |
| 0.7993055555555556 | 0 |
| 0.7999999999999999 | 0 |
| 0.8006944444444444 | 0 |
| 0.8013888888888889 | 0 |
| 0.8020833333333334 | 0 |
| 0.8027777777777777 | 0 |
| 0.8034722222222223 | 0 |
| 0.8041666666666667 | 0 |
| 0.8048611111111111 | 0 |
| 0.8055555555555555 | 0 |
| 0.80625 | 0 |
| 0.8069444444444445 | 0 |
| 0.8076388888888889 | 0 |
| 0.8083333333333332 | 0 |
| 0.8090277777777778 | 0 |
| 0.8097222222222222 | 0 |
| 0.8104166666666667 | 0 |
| 0.811111111111111 | 0 |
| 0.8118055555555556 | 0 |
| 0.8125 | 0 |
| 0.8131944444444444 | 0 |
| 0.813888888888889 | 0 |
| 0.8145833333333333 | 0 |
| 0.8152777777777778 | 0 |
| 0.8159722222222222 | 0 |
| 0.8166666666666668 | 0 |
| 0.8173611111111111 | 0 |
| 0.8180555555555555 | 0 |
| 0.81875 | 0 |
| 0.8194444444444445 | 0 |
| 0.8201388888888889 | 0 |
| 0.8208333333333333 | 0 |
| 0.8215277777777777 | 0 |
| 0.8222222222222223 | 0 |
| 0.8229166666666666 | 0 |
| 0.8236111111111111 | 0 |
| 0.8243055555555556 | 0 |
| 0.8250000000000001 | 0 |
| 0.8256944444444444 | 0 |
| 0.8263888888888888 | 0 |
| 0.8270833333333334 | 0 |
| 0.8277777777777778 | 0 |
| 0.8284722222222222 | 0 |
| 0.8291666666666666 | 0 |
| 0.8298611111111112 | 0 |
| 0.8305555555555556 | 0 |
| 0.8312499999999999 | 0 |
| 0.8319444444444444 | 0 |
| 0.8326388888888889 | 0 |
| 0.8333333333333334 | 0 |
| 0.8340277777777777 | 0 |
| 0.8347222222222223 | 0 |
| 0.8354166666666667 | 0 |
| 0.8361111111111111 | 0 |
| 0.8368055555555555 | 0 |
| 0.8375 | 0 |
| 0.8381944444444445 | 0 |
| 0.8388888888888889 | 0 |
| 0.8395833333333332 | 0 |
| 0.8402777777777778 | 0 |
| 0.8409722222222222 | 0 |
| 0.8416666666666667 | 0 |
| 0.842361111111111 | 0 |
| 0.8430555555555556 | 0 |
| 0.84375 | 0 |
| 0.8444444444444444 | 0 |
| 0.845138888888889 | 0 |
| 0.8458333333333333 | 0 |
| 0.8465277777777778 | 0 |
| 0.8472222222222222 | 0 |
| 0.8479166666666668 | 0 |
| 0.8486111111111111 | 0 |
| 0.8493055555555555 | 0 |
| 0.85 | 0 |
| 0.8506944444444445 | 0 |
| 0.8513888888888889 | 0 |
| 0.8520833333333333 | 0 |
| 0.8527777777777777 | 0 |
| 0.8534722222222223 | 0 |
| 0.8541666666666666 | 0 |
| 0.8548611111111111 | 0 |
| 0.8555555555555556 | 0 |
| 0.8562500000000001 | 0 |
| 0.8569444444444444 | 0 |
| 0.8576388888888888 | 0 |
| 0.8583333333333334 | 0 |
| 0.8590277777777778 | 0 |
| 0.8597222222222222 | 0 |
| 0.8604166666666666 | 0 |
| 0.8611111111111112 | 0 |
| 0.8618055555555556 | 0 |
| 0.8624999999999999 | 0 |
| 0.8631944444444444 | 0 |
| 0.8638888888888889 | 0 |
| 0.8645833333333334 | 0 |
| 0.8652777777777777 | 0 |
| 0.8659722222222223 | 0 |
| 0.8666666666666667 | 0 |
| 0.8673611111111111 | 0 |
| 0.8680555555555555 | 0 |
| 0.86875 | 0 |
| 0.8694444444444445 | 0 |
| 0.8701388888888889 | 0 |
| 0.8708333333333332 | 0 |
| 0.8715277777777778 | 0 |
| 0.8722222222222222 | 0 |
| 0.8729166666666667 | 0 |
| 0.873611111111111 | 0 |
| 0.8743055555555556 | 0 |
| 0.875 | 0 |
| 0.8756944444444444 | 0 |
| 0.876388888888889 | 0 |
| 0.8770833333333333 | 0 |
| 0.8777777777777778 | 0 |
| 0.8784722222222222 | 0 |
| 0.8791666666666668 | 0 |
| 0.8798611111111111 | 0 |
| 0.8805555555555555 | 0 |
| 0.88125 | 0 |
| 0.8819444444444445 | 0 |
| 0.8826388888888889 | 0 |
| 0.8833333333333333 | 0 |
| 0.8840277777777777 | 0 |
| 0.8847222222222223 | 0 |
| 0.8854166666666666 | 0 |
| 0.8861111111111111 | 0 |
| 0.8868055555555556 | 0 |
| 0.8875000000000001 | 0 |
| 0.8881944444444444 | 0 |
| 0.8888888888888888 | 0 |
| 0.8895833333333334 | 0 |
| 0.8902777777777778 | 0 |
| 0.8909722222222222 | 0 |
| 0.8916666666666666 | 0 |
| 0.8923611111111112 | 0 |
| 0.8930555555555556 | 0 |
| 0.8937499999999999 | 0 |
| 0.8944444444444444 | 0 |
| 0.8951388888888889 | 0 |
| 0.8958333333333334 | 0 |
| 0.8965277777777777 | 0 |
| 0.8972222222222223 | 0 |
| 0.8979166666666667 | 0 |
| 0.8986111111111111 | 0 |
| 0.8993055555555555 | 0 |
| 0.9 | 0 |
| 0.9006944444444445 | 0 |
| 0.9013888888888889 | 0 |
| 0.9020833333333332 | 0 |
| 0.9027777777777778 | 0 |
| 0.9034722222222222 | 0 |
| 0.9041666666666667 | 0 |
| 0.904861111111111 | 0 |
| 0.9055555555555556 | 0 |
| 0.90625 | 0 |
| 0.9069444444444444 | 0 |
| 0.907638888888889 | 0 |
| 0.9083333333333333 | 0 |
| 0.9090277777777778 | 0 |
| 0.9097222222222222 | 0 |
| 0.9104166666666668 | 0 |
| 0.9111111111111111 | 0 |
| 0.9118055555555555 | 0 |
| 0.9125 | 0 |
| 0.9131944444444445 | 0 |
| 0.9138888888888889 | 0 |
| 0.9145833333333333 | 0 |
| 0.9152777777777777 | 0 |
| 0.9159722222222223 | 0 |
| 0.9166666666666666 | 0 |
| 0.9173611111111111 | 0 |
| 0.9180555555555556 | 0 |
| 0.9187500000000001 | 0 |
| 0.9194444444444444 | 0 |
| 0.9201388888888888 | 0 |
| 0.9208333333333334 | 0 |
| 0.9215277777777778 | 0 |
| 0.9222222222222222 | 0 |
| 0.9229166666666666 | 0 |
| 0.9236111111111112 | 0 |
| 0.9243055555555556 | 0 |
| 0.9249999999999999 | 0 |
| 0.9256944444444444 | 0 |
| 0.9263888888888889 | 0 |
| 0.9270833333333334 | 0 |
| 0.9277777777777777 | 0 |
| 0.9284722222222223 | 0 |
| 0.9291666666666667 | 0 |
| 0.9298611111111111 | 0 |
| 0.9305555555555555 | 0 |
| 0.93125 | 0 |
| 0.9319444444444445 | 0 |
| 0.9326388888888889 | 0 |
| 0.9333333333333332 | 0 |
| 0.9340277777777778 | 0 |
| 0.9347222222222222 | 0 |
| 0.9354166666666667 | 0 |
| 0.936111111111111 | 0 |
| 0.9368055555555556 | 0 |
| 0.9375 | 0 |
| 0.9381944444444444 | 0 |
| 0.938888888888889 | 0 |
| 0.9395833333333333 | 0 |
| 0.9402777777777778 | 0 |
| 0.9409722222222222 | 0 |
| 0.9416666666666668 | 0 |
| 0.9423611111111111 | 0 |
| 0.9430555555555555 | 0 |
| 0.94375 | 0 |
| 0.9444444444444445 | 0 |
| 0.9451388888888889 | 0 |
| 0.9458333333333333 | 0 |
| 0.9465277777777777 | 0 |
| 0.9472222222222223 | 0 |
| 0.9479166666666666 | 0 |
| 0.9486111111111111 | 0 |
| 0.9493055555555556 | 0 |
| 0.9500000000000001 | 0 |
| 0.9506944444444444 | 0 |
| 0.9513888888888888 | 0 |
| 0.9520833333333334 | 0 |
| 0.9527777777777778 | 0 |
| 0.9534722222222222 | 0 |
| 0.9541666666666666 | 0 |
| 0.9548611111111112 | 0 |
| 0.9555555555555556 | 0 |
| 0.9562499999999999 | 0 |
| 0.9569444444444444 | 0 |
| 0.9576388888888889 | 0 |
| 0.9583333333333334 | 0 |
| 0.9590277777777777 | 0 |
| 0.9597222222222223 | 0 |
| 0.9604166666666667 | 0 |
| 0.9611111111111111 | 0 |
| 0.9618055555555555 | 0 |
| 0.9625 | 0 |
| 0.9631944444444445 | 0 |
| 0.9638888888888889 | 0 |
| 0.9645833333333332 | 0 |
| 0.9652777777777778 | 0 |
| 0.9659722222222222 | 0 |
| 0.9666666666666667 | 0 |
| 0.967361111111111 | 0 |
| 0.9680555555555556 | 0 |
| 0.96875 | 0 |
| 0.9694444444444444 | 0 |
| 0.970138888888889 | 0 |
| 0.9708333333333333 | 0 |
| 0.9715277777777778 | 0 |
| 0.9722222222222222 | 0 |
| 0.9729166666666668 | 0 |
| 0.9736111111111111 | 0 |
| 0.9743055555555555 | 0 |
| 0.975 | 0 |
| 0.9756944444444445 | 0 |
| 0.9763888888888889 | 0 |
| 0.9770833333333333 | 0 |
| 0.9777777777777777 | 0 |
| 0.9784722222222223 | 0 |
| 0.9791666666666666 | 0 |
| 0.9798611111111111 | 0 |
| 0.9805555555555556 | 0 |
| 0.9812500000000001 | 0 |
| 0.9819444444444444 | 0 |
| 0.9826388888888888 | 0 |
| 0.9833333333333334 | 0 |
| 0.9840277777777778 | 0 |
| 0.9847222222222222 | 0 |
| 0.9854166666666666 | 0 |
| 0.9861111111111112 | 0 |
| 0.9868055555555556 | 0 |
| 0.9874999999999999 | 0 |
| 0.9881944444444444 | 0 |
| 0.9888888888888889 | 0 |
| 0.9895833333333334 | 0 |
| 0.9902777777777777 | 0 |
| 0.9909722222222223 | 0 |
| 0.9916666666666667 | 0 |
| 0.9923611111111111 | 0 |
| 0.9930555555555555 | 0 |
| 0.99375 | 0 |
| 0.9944444444444445 | 0 |
| 0.9951388888888889 | 0 |
| 0.9958333333333332 | 0 |
| 0.9965277777777778 | 0 |
| 0.9972222222222222 | 0 |
| 0.9979166666666667 | 0 |
| 0.998611111111111 | 0 |
| 0.9993055555555556 | 0 |